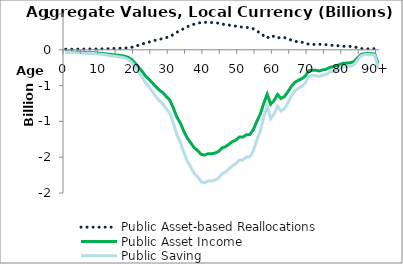
| Category | Public Asset-based Reallocations | Public Asset Income | Public Saving |
|---|---|---|---|
| 0 | 8.092 | -30.902 | -38.994 |
|  | 7.989 | -30.508 | -38.497 |
| 2 | 8.125 | -31.03 | -39.156 |
| 3 | 9.049 | -34.557 | -43.606 |
| 4 | 9.156 | -34.965 | -44.12 |
| 5 | 9.583 | -36.597 | -46.18 |
| 6 | 10.312 | -39.382 | -49.695 |
| 7 | 10.588 | -40.437 | -51.025 |
| 8 | 10.856 | -41.458 | -52.314 |
| 9 | 11.866 | -45.317 | -57.184 |
| 10 | 12.942 | -49.426 | -62.369 |
| 11 | 13.899 | -53.08 | -66.979 |
| 12 | 15.134 | -57.796 | -72.93 |
| 13 | 17.517 | -66.895 | -84.412 |
| 14 | 18.224 | -69.597 | -87.821 |
| 15 | 19.937 | -76.138 | -96.075 |
| 16 | 21.127 | -80.683 | -101.81 |
| 17 | 23.627 | -90.23 | -113.856 |
| 18 | 27.805 | -106.184 | -133.989 |
| 19 | 35.643 | -136.12 | -171.763 |
| 20 | 49.069 | -187.393 | -236.462 |
| 21 | 63.831 | -243.768 | -307.6 |
| 22 | 79.064 | -301.941 | -381.005 |
| 23 | 96.712 | -369.34 | -466.052 |
| 24 | 107.747 | -411.48 | -519.227 |
| 25 | 121.836 | -465.284 | -587.119 |
| 26 | 135.764 | -518.477 | -654.241 |
| 27 | 147.717 | -564.122 | -711.839 |
| 28 | 157.029 | -599.686 | -756.716 |
| 29 | 171.572 | -655.224 | -826.795 |
| 30 | 184.667 | -705.233 | -889.9 |
| 31 | 213.345 | -814.754 | -1028.099 |
| 32 | 246.143 | -940.008 | -1186.152 |
| 33 | 267.528 | -1021.673 | -1289.201 |
| 34 | 297.521 | -1136.216 | -1433.736 |
| 35 | 322.786 | -1232.701 | -1555.487 |
| 36 | 340.233 | -1299.331 | -1639.564 |
| 37 | 358 | -1367.182 | -1725.182 |
| 38 | 368.785 | -1408.368 | -1777.153 |
| 39 | 382.547 | -1460.927 | -1843.474 |
| 40 | 385.036 | -1470.431 | -1855.467 |
| 41 | 379.813 | -1450.484 | -1830.297 |
| 42 | 380.336 | -1452.481 | -1832.816 |
| 43 | 377.498 | -1441.646 | -1819.144 |
| 44 | 371.702 | -1419.509 | -1791.21 |
| 45 | 358.885 | -1370.562 | -1729.447 |
| 46 | 354.377 | -1353.345 | -1707.722 |
| 47 | 345.477 | -1319.357 | -1664.834 |
| 48 | 335.583 | -1281.573 | -1617.156 |
| 49 | 330.208 | -1261.047 | -1591.255 |
| 50 | 319.068 | -1218.503 | -1537.572 |
| 51 | 319.049 | -1218.43 | -1537.479 |
| 52 | 311.096 | -1188.057 | -1499.153 |
| 53 | 310.003 | -1183.883 | -1493.886 |
| 54 | 293.148 | -1119.517 | -1412.665 |
| 55 | 262.146 | -1001.12 | -1263.266 |
| 56 | 235.904 | -900.904 | -1136.808 |
| 57 | 196.515 | -750.481 | -946.996 |
| 58 | 162.683 | -621.278 | -783.961 |
| 59 | 199.432 | -761.619 | -961.05 |
| 60 | 185.538 | -708.56 | -894.098 |
| 61 | 163.381 | -623.942 | -787.322 |
| 62 | 177.818 | -679.077 | -856.895 |
| 63 | 170.739 | -652.044 | -822.783 |
| 64 | 153.069 | -584.561 | -737.63 |
| 65 | 133.203 | -508.694 | -641.896 |
| 66 | 118.653 | -453.129 | -571.782 |
| 67 | 111.835 | -427.091 | -538.925 |
| 68 | 105.483 | -402.835 | -508.318 |
| 69 | 96.312 | -367.81 | -464.122 |
| 70 | 76.343 | -291.548 | -367.89 |
| 71 | 74.797 | -285.644 | -360.441 |
| 72 | 74.775 | -285.562 | -360.337 |
| 73 | 77.37 | -295.47 | -372.84 |
| 74 | 73.459 | -280.537 | -353.996 |
| 75 | 71.293 | -272.265 | -343.558 |
| 76 | 64.756 | -247.301 | -312.057 |
| 77 | 61.644 | -235.416 | -297.06 |
| 78 | 59.046 | -225.495 | -284.541 |
| 79 | 52.702 | -201.266 | -253.967 |
| 80 | 49.161 | -187.742 | -236.903 |
| 81 | 48.439 | -184.985 | -233.424 |
| 82 | 47.386 | -180.965 | -228.351 |
| 83 | 43.109 | -164.63 | -207.738 |
| 84 | 30.01 | -114.607 | -144.617 |
| 85 | 17.568 | -67.091 | -84.659 |
| 86 | 14.335 | -54.743 | -69.078 |
| 87 | 13.388 | -51.128 | -64.516 |
| 88 | 14.427 | -55.098 | -69.525 |
| 89 | 15.531 | -59.313 | -74.844 |
| 90+ | 53.107 | -202.814 | -255.921 |